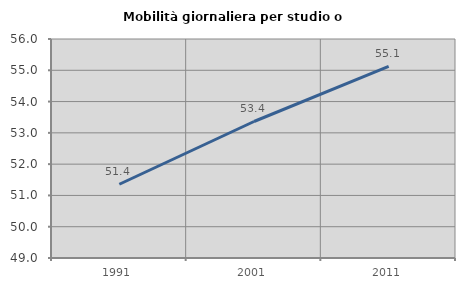
| Category | Mobilità giornaliera per studio o lavoro |
|---|---|
| 1991.0 | 51.357 |
| 2001.0 | 53.363 |
| 2011.0 | 55.124 |